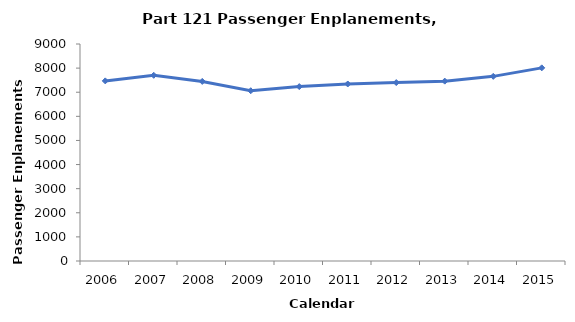
| Category | Passengers (100,000s) |
|---|---|
| 2006.0 | 7470 |
| 2007.0 | 7702.619 |
| 2008.0 | 7448.246 |
| 2009.0 | 7061.064 |
| 2010.0 | 7232.912 |
| 2011.0 | 7341.547 |
| 2012.0 | 7399.775 |
| 2013.0 | 7459.964 |
| 2014.0 | 7658.059 |
| 2015.0 | 8010.574 |